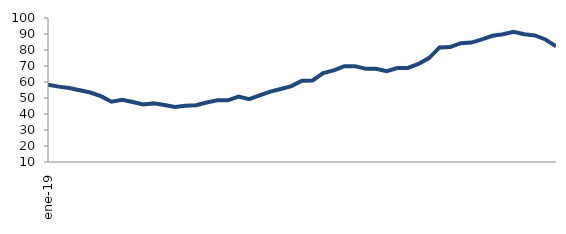
| Category | Series 0 |
|---|---|
| 2019-01-01 | 58.376 |
| 2019-02-01 | 57.103 |
| 2019-03-01 | 56.217 |
| 2019-04-01 | 54.855 |
| 2019-05-01 | 53.426 |
| 2019-06-01 | 51.167 |
| 2019-07-01 | 47.705 |
| 2019-08-01 | 48.94 |
| 2019-09-01 | 47.515 |
| 2019-10-01 | 45.989 |
| 2019-11-01 | 46.631 |
| 2019-12-01 | 45.576 |
| 2020-01-01 | 44.444 |
| 2020-02-01 | 45.166 |
| 2020-03-01 | 45.444 |
| 2020-04-01 | 47.162 |
| 2020-05-01 | 48.595 |
| 2020-06-01 | 48.53 |
| 2020-07-01 | 50.83 |
| 2020-08-01 | 49.231 |
| 2020-09-01 | 51.699 |
| 2020-10-01 | 53.991 |
| 2020-11-01 | 55.639 |
| 2020-12-01 | 57.413 |
| 2021-01-01 | 60.742 |
| 2021-02-01 | 60.984 |
| 2021-03-01 | 65.524 |
| 2021-04-01 | 67.28 |
| 2021-05-01 | 69.863 |
| 2021-06-01 | 69.912 |
| 2021-07-01 | 68.331 |
| 2021-08-01 | 68.248 |
| 2021-09-01 | 66.807 |
| 2021-10-01 | 68.707 |
| 2021-11-01 | 68.802 |
| 2021-12-01 | 71.282 |
| 2022-01-01 | 74.964 |
| 2022-02-01 | 81.594 |
| 2022-03-01 | 81.823 |
| 2022-04-01 | 84.283 |
| 2022-05-01 | 84.65 |
| 2022-06-01 | 86.683 |
| 2022-07-01 | 88.894 |
| 2022-08-01 | 89.887 |
| 2022-09-01 | 91.356 |
| 2022-10-01 | 89.801 |
| 2022-11-01 | 89.064 |
| 2022-12-01 | 86.562 |
| 2023-01-01 | 82.272 |